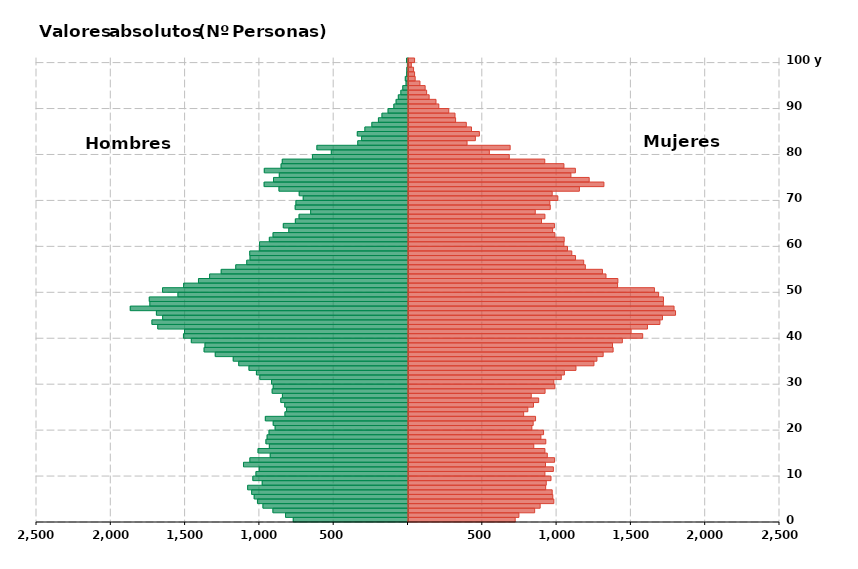
| Category | Hombres | Mujeres |
|---|---|---|
| 0 | -772 | 718 |
| 1 | -824 | 743 |
| 2 | -909 | 849 |
| 3 | -976 | 886 |
| 4 | -1013 | 978 |
| 5 | -1035 | 971 |
| 6 | -1052 | 967 |
| 7 | -1079 | 923 |
| 8 | -981 | 927 |
| 9 | -1044 | 959 |
| 10 | -1023 | 918 |
| 11 | -1001 | 975 |
| 12 | -1107 | 922 |
| 13 | -1064 | 983 |
| 14 | -927 | 934 |
| 15 | -1009 | 918 |
| 16 | -933 | 843 |
| 17 | -956 | 924 |
| 18 | -948 | 891 |
| 19 | -935 | 909 |
| 20 | -894 | 830 |
| 21 | -907 | 839 |
| 22 | -960 | 855 |
| 23 | -828 | 775 |
| 24 | -817 | 803 |
| 25 | -829 | 841 |
| 26 | -856 | 876 |
| 27 | -845 | 826 |
| 28 | -914 | 919 |
| 29 | -907 | 985 |
| 30 | -918 | 978 |
| 31 | -997 | 1028 |
| 32 | -1020 | 1049 |
| 33 | -1070 | 1127 |
| 34 | -1139 | 1248 |
| 35 | -1176 | 1268 |
| 36 | -1297 | 1310 |
| 37 | -1372 | 1377 |
| 38 | -1366 | 1373 |
| 39 | -1458 | 1439 |
| 40 | -1511 | 1576 |
| 41 | -1504 | 1498 |
| 42 | -1684 | 1608 |
| 43 | -1723 | 1692 |
| 44 | -1651 | 1709 |
| 45 | -1693 | 1797 |
| 46 | -1869 | 1787 |
| 47 | -1737 | 1715 |
| 48 | -1741 | 1716 |
| 49 | -1548 | 1683 |
| 50 | -1652 | 1655 |
| 51 | -1510 | 1407 |
| 52 | -1410 | 1409 |
| 53 | -1335 | 1329 |
| 54 | -1257 | 1305 |
| 55 | -1159 | 1190 |
| 56 | -1085 | 1179 |
| 57 | -1063 | 1124 |
| 58 | -1065 | 1099 |
| 59 | -998 | 1070 |
| 60 | -999 | 1046 |
| 61 | -933 | 1048 |
| 62 | -908 | 985 |
| 63 | -802 | 970 |
| 64 | -839 | 982 |
| 65 | -758 | 895 |
| 66 | -733 | 918 |
| 67 | -655 | 853 |
| 68 | -759 | 954 |
| 69 | -754 | 951 |
| 70 | -705 | 1005 |
| 71 | -732 | 967 |
| 72 | -868 | 1150 |
| 73 | -968 | 1315 |
| 74 | -905 | 1216 |
| 75 | -866 | 1093 |
| 76 | -967 | 1123 |
| 77 | -854 | 1046 |
| 78 | -846 | 917 |
| 79 | -643 | 678 |
| 80 | -516 | 544 |
| 81 | -613 | 684 |
| 82 | -338 | 394 |
| 83 | -312 | 450 |
| 84 | -341 | 477 |
| 85 | -290 | 424 |
| 86 | -243 | 389 |
| 87 | -199 | 317 |
| 88 | -175 | 313 |
| 89 | -134 | 271 |
| 90 | -95 | 204 |
| 91 | -80 | 185 |
| 92 | -65 | 139 |
| 93 | -48 | 122 |
| 94 | -35 | 112 |
| 95 | -13 | 77 |
| 96 | -18 | 45 |
| 97 | -9 | 41 |
| 98 | -8 | 34 |
| 99 | -4 | 19 |
| 100 | -10 | 41 |